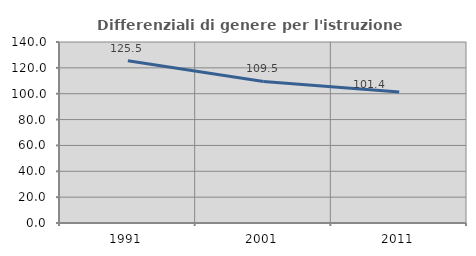
| Category | Differenziali di genere per l'istruzione superiore |
|---|---|
| 1991.0 | 125.537 |
| 2001.0 | 109.513 |
| 2011.0 | 101.377 |